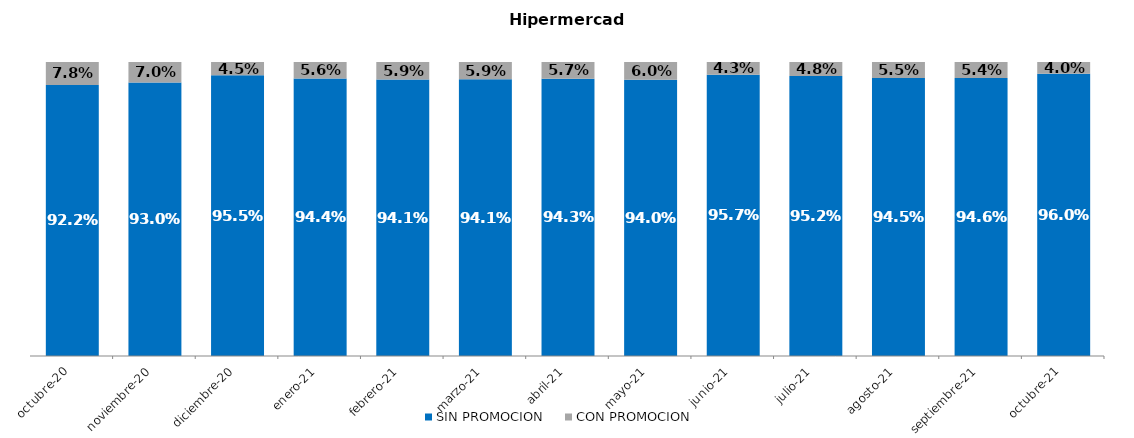
| Category | SIN PROMOCION   | CON PROMOCION   |
|---|---|---|
| 2020-10-01 | 0.922 | 0.078 |
| 2020-11-01 | 0.93 | 0.07 |
| 2020-12-01 | 0.955 | 0.045 |
| 2021-01-01 | 0.944 | 0.056 |
| 2021-02-01 | 0.941 | 0.059 |
| 2021-03-01 | 0.941 | 0.059 |
| 2021-04-01 | 0.943 | 0.057 |
| 2021-05-01 | 0.94 | 0.06 |
| 2021-06-01 | 0.957 | 0.043 |
| 2021-07-01 | 0.952 | 0.048 |
| 2021-08-01 | 0.945 | 0.055 |
| 2021-09-01 | 0.946 | 0.054 |
| 2021-10-01 | 0.96 | 0.04 |